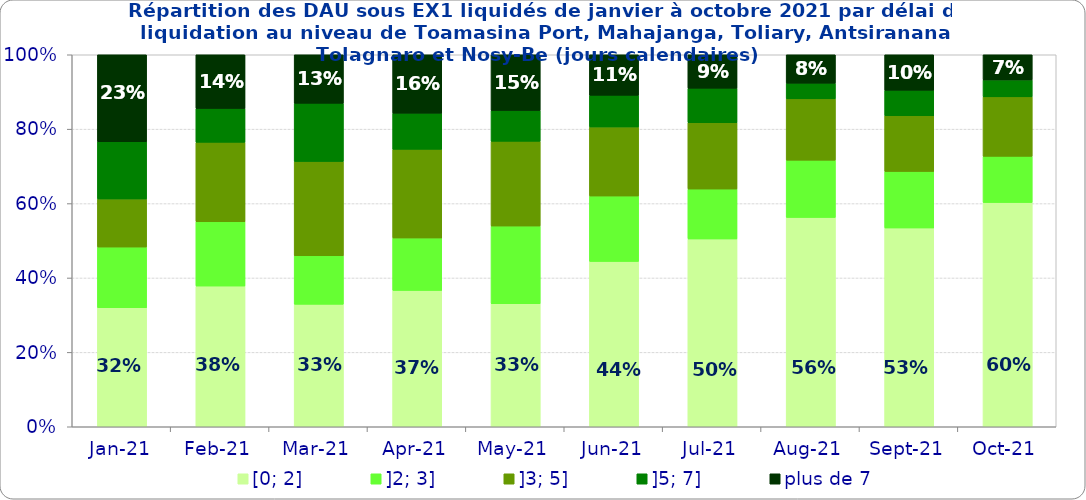
| Category | [0; 2] | ]2; 3] | ]3; 5] | ]5; 7] | plus de 7 |
|---|---|---|---|---|---|
| 2021-01-01 | 0.32 | 0.163 | 0.129 | 0.154 | 0.234 |
| 2021-02-01 | 0.378 | 0.173 | 0.214 | 0.091 | 0.144 |
| 2021-03-01 | 0.329 | 0.13 | 0.253 | 0.157 | 0.13 |
| 2021-04-01 | 0.367 | 0.141 | 0.238 | 0.097 | 0.157 |
| 2021-05-01 | 0.331 | 0.209 | 0.228 | 0.083 | 0.15 |
| 2021-06-01 | 0.444 | 0.176 | 0.186 | 0.085 | 0.109 |
| 2021-07-01 | 0.505 | 0.134 | 0.178 | 0.093 | 0.09 |
| 2021-08-01 | 0.563 | 0.154 | 0.165 | 0.042 | 0.076 |
| 2021-09-01 | 0.534 | 0.152 | 0.15 | 0.069 | 0.095 |
| 2021-10-01 | 0.603 | 0.124 | 0.16 | 0.046 | 0.068 |